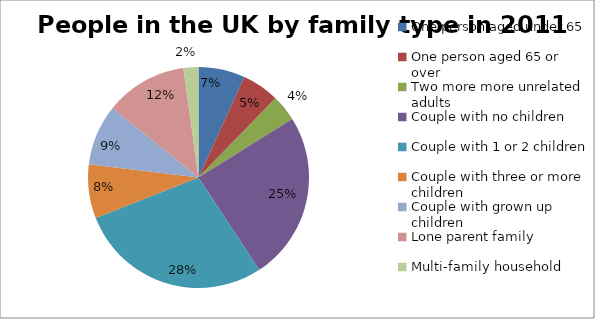
| Category | Series 0 |
|---|---|
| One person aged under 65 | 0.068 |
| One person aged 65 or over | 0.055 |
| Two more more unrelated adults | 0.038 |
| Couple with no children | 0.246 |
| Couple with 1 or 2 children | 0.283 |
| Couple with three or more children | 0.079 |
| Couple with grown up children | 0.089 |
| Lone parent family | 0.12 |
| Multi-family household | 0.022 |